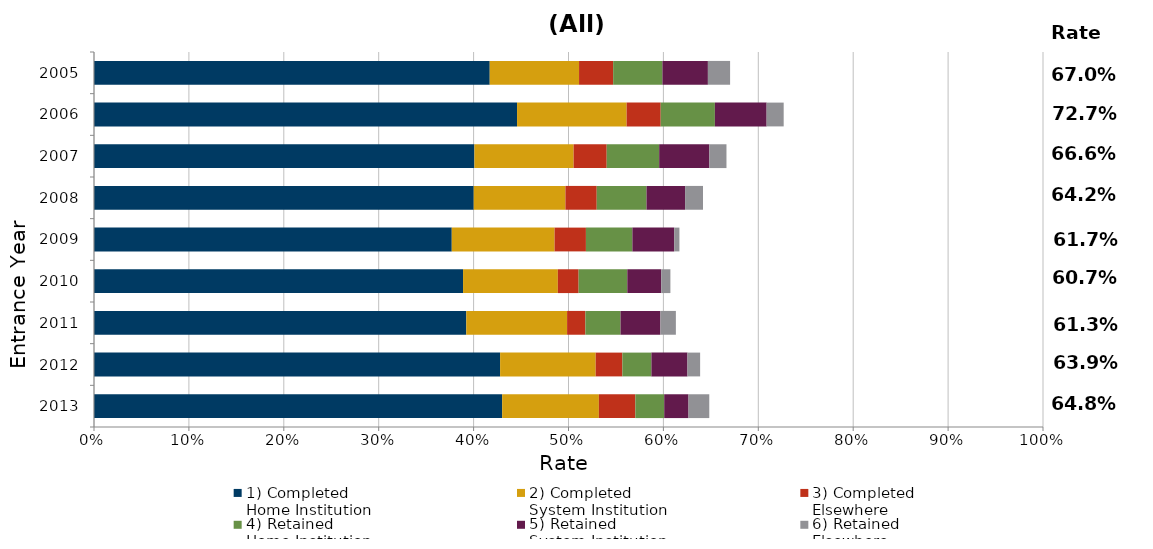
| Category | 1) Completed 
Home Institution | 2) Completed 
System Institution | 3) Completed 
Elsewhere | 4) Retained 
Home Institution | 5) Retained 
System Institution | 6) Retained 
Elsewhere | 7) Stopped Out |
|---|---|---|---|---|---|---|---|
| 2013.0 | 0.43 | 0.102 | 0.038 | 0.03 | 0.026 | 0.022 | 0.352 |
| 2012.0 | 0.428 | 0.101 | 0.028 | 0.031 | 0.038 | 0.013 | 0.361 |
| 2011.0 | 0.392 | 0.106 | 0.019 | 0.037 | 0.042 | 0.016 | 0.387 |
| 2010.0 | 0.389 | 0.1 | 0.022 | 0.051 | 0.036 | 0.01 | 0.393 |
| 2009.0 | 0.377 | 0.108 | 0.033 | 0.049 | 0.044 | 0.006 | 0.383 |
| 2008.0 | 0.4 | 0.097 | 0.033 | 0.052 | 0.041 | 0.019 | 0.358 |
| 2007.0 | 0.401 | 0.105 | 0.035 | 0.055 | 0.053 | 0.018 | 0.334 |
| 2006.0 | 0.446 | 0.115 | 0.036 | 0.057 | 0.055 | 0.018 | 0.273 |
| 2005.0 | 0.417 | 0.094 | 0.036 | 0.052 | 0.048 | 0.023 | 0.33 |